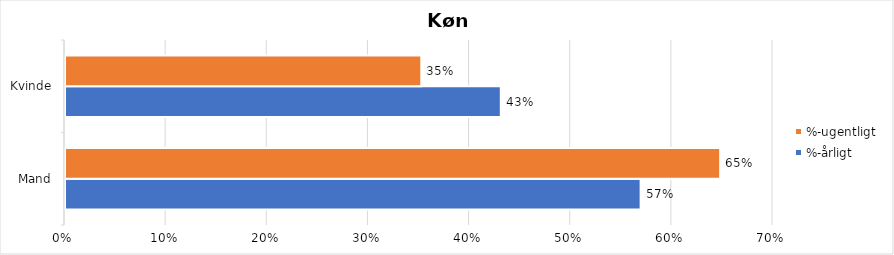
| Category | %-årligt | %-ugentligt |
|---|---|---|
| Mand | 0.569 | 0.648 |
| Kvinde | 0.431 | 0.352 |